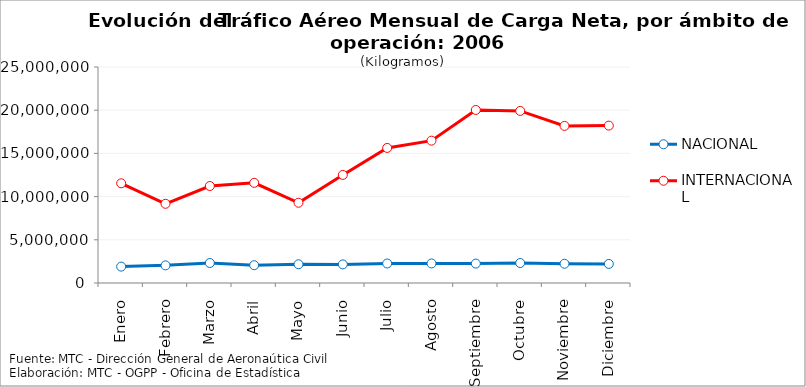
| Category | NACIONAL | INTERNACIONAL |
|---|---|---|
| Enero | 1895646 | 11539098 |
| Febrero | 2040616 | 9166846 |
| Marzo | 2316397 | 11225166 |
| Abril | 2059001 | 11593882 |
| Mayo | 2169770 | 9286608 |
| Junio | 2153796 | 12508737 |
| Julio | 2258065 | 15634607 |
| Agosto | 2264180 | 16474251 |
| Septiembre | 2246570 | 20028029 |
| Octubre | 2312678 | 19920180 |
| Noviembre | 2225586 | 18182776 |
| Diciembre | 2208527 | 18217184 |